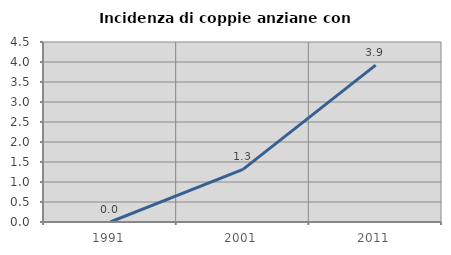
| Category | Incidenza di coppie anziane con figli |
|---|---|
| 1991.0 | 0 |
| 2001.0 | 1.316 |
| 2011.0 | 3.922 |